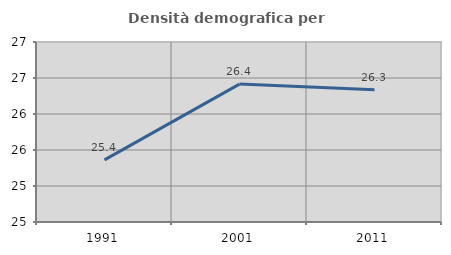
| Category | Densità demografica |
|---|---|
| 1991.0 | 25.363 |
| 2001.0 | 26.415 |
| 2011.0 | 26.336 |